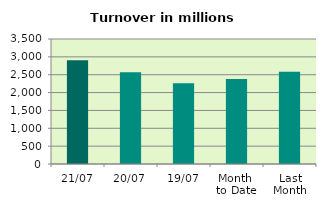
| Category | Series 0 |
|---|---|
| 21/07 | 2905.93 |
| 20/07 | 2571.55 |
| 19/07 | 2263.719 |
| Month 
to Date | 2379.498 |
| Last
Month | 2579.746 |